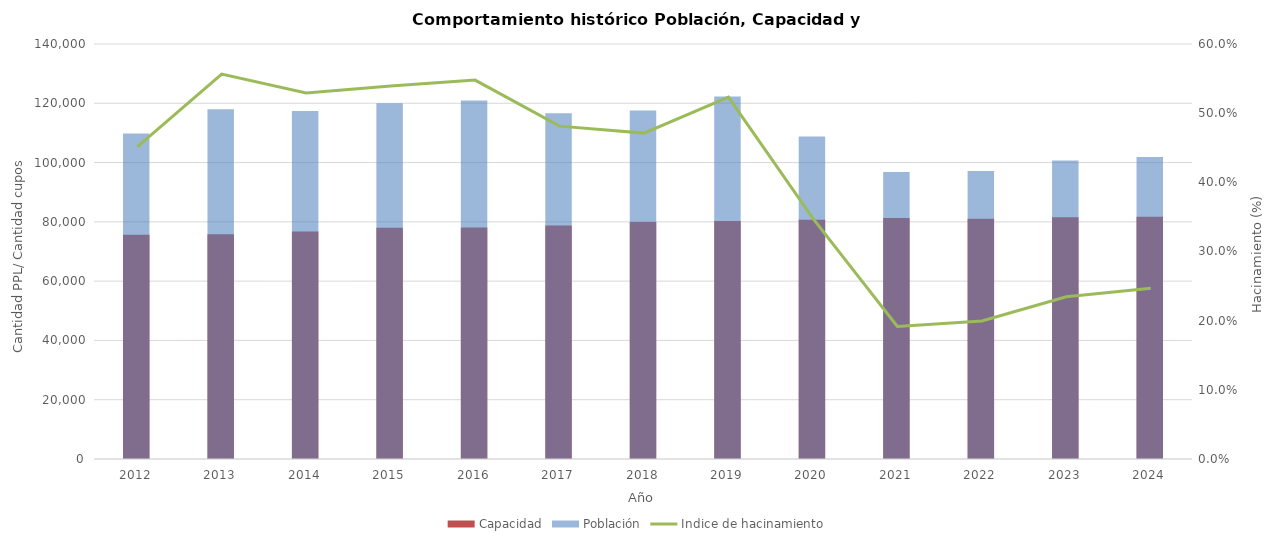
| Category | Capacidad | Población |
|---|---|---|
| 2012.0 | 75679.167 | 109822.083 |
| 2013.0 | 75796.583 | 117986.5 |
| 2014.0 | 76777 | 117389.083 |
| 2015.0 | 77979.75 | 120040.083 |
| 2016.0 | 78119.5 | 120914 |
| 2017.0 | 78759 | 116657.667 |
| 2018.0 | 79914 | 117569.583 |
| 2019.0 | 80296.167 | 122309.5 |
| 2020.0 | 80704.167 | 108777.75 |
| 2021.0 | 81268.833 | 96837.5 |
| 2022.0 | 81010.417 | 97175.917 |
| 2023.0 | 81594 | 100737.75 |
| 2024.0 | 81736 | 101908.667 |